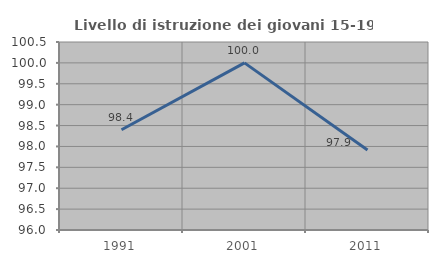
| Category | Livello di istruzione dei giovani 15-19 anni |
|---|---|
| 1991.0 | 98.4 |
| 2001.0 | 100 |
| 2011.0 | 97.917 |